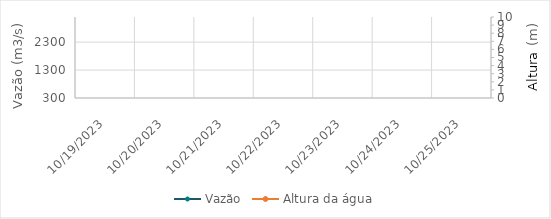
| Category | Vazão |
|---|---|
| 5/11/23 | 1852.06 |
| 5/10/23 | 1883.27 |
| 5/9/23 | 1907.49 |
| 5/8/23 | 1788.63 |
| 5/7/23 | 1599.13 |
| 5/6/23 | 1329.98 |
| 5/5/23 | 1250.42 |